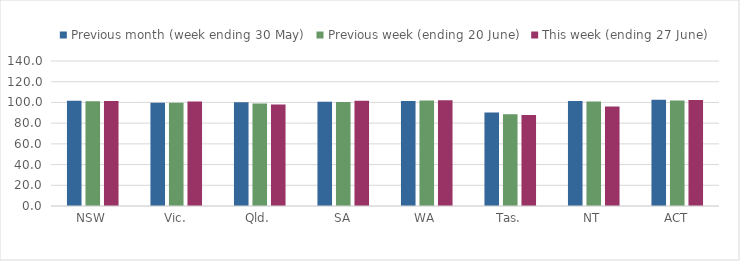
| Category | Previous month (week ending 30 May) | Previous week (ending 20 June) | This week (ending 27 June) |
|---|---|---|---|
| NSW | 101.725 | 101.238 | 101.426 |
| Vic. | 99.658 | 99.69 | 100.843 |
| Qld. | 100.197 | 98.945 | 98.107 |
| SA | 100.666 | 100.397 | 101.595 |
| WA | 101.281 | 101.93 | 102.016 |
| Tas. | 90.232 | 88.545 | 87.948 |
| NT | 101.296 | 100.926 | 96.144 |
| ACT | 102.655 | 101.871 | 102.369 |